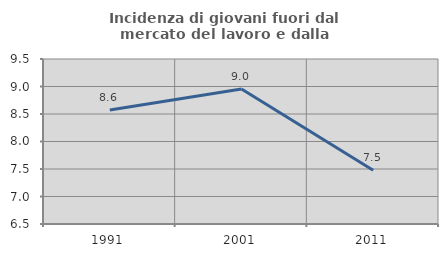
| Category | Incidenza di giovani fuori dal mercato del lavoro e dalla formazione  |
|---|---|
| 1991.0 | 8.571 |
| 2001.0 | 8.955 |
| 2011.0 | 7.477 |